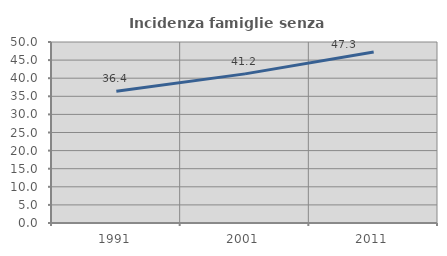
| Category | Incidenza famiglie senza nuclei |
|---|---|
| 1991.0 | 36.42 |
| 2001.0 | 41.198 |
| 2011.0 | 47.263 |